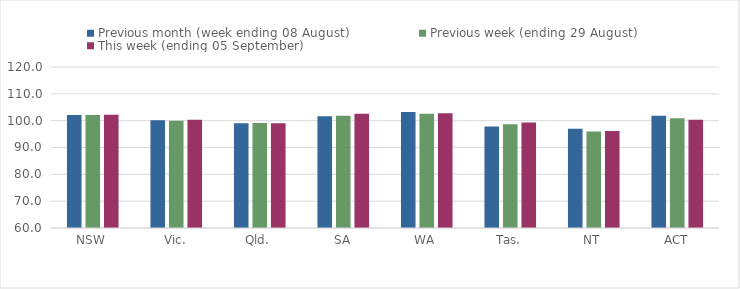
| Category | Previous month (week ending 08 August) | Previous week (ending 29 August) | This week (ending 05 September) |
|---|---|---|---|
| NSW | 102.14 | 102.14 | 102.24 |
| Vic. | 100.14 | 99.93 | 100.35 |
| Qld. | 99.04 | 99.15 | 99.05 |
| SA | 101.63 | 101.87 | 102.54 |
| WA | 103.27 | 102.6 | 102.74 |
| Tas. | 97.84 | 98.62 | 99.32 |
| NT | 96.98 | 96 | 96.16 |
| ACT | 101.85 | 100.87 | 100.37 |